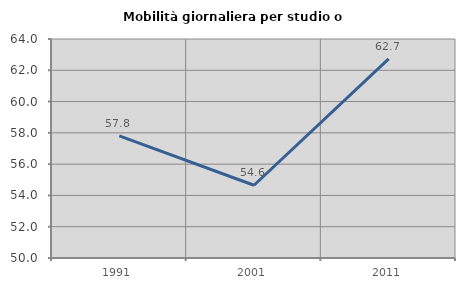
| Category | Mobilità giornaliera per studio o lavoro |
|---|---|
| 1991.0 | 57.812 |
| 2001.0 | 54.649 |
| 2011.0 | 62.731 |